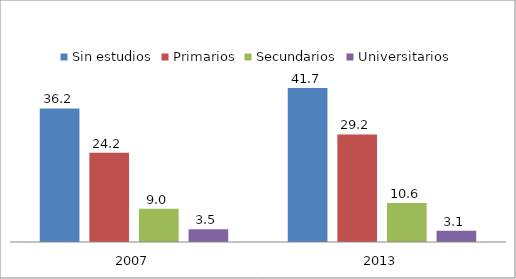
| Category | Sin estudios | Primarios | Secundarios | Universitarios |
|---|---|---|---|---|
| 2007 | 36.221 | 24.169 | 8.994 | 3.481 |
| 2013 | 41.74 | 29.164 | 10.562 | 3.068 |